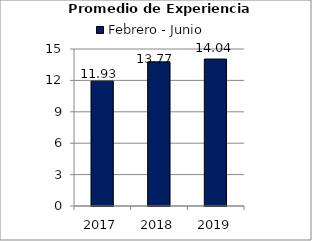
| Category | Febrero - Junio |
|---|---|
| 2017.0 | 11.93 |
| 2018.0 | 13.77 |
| 2019.0 | 14.04 |